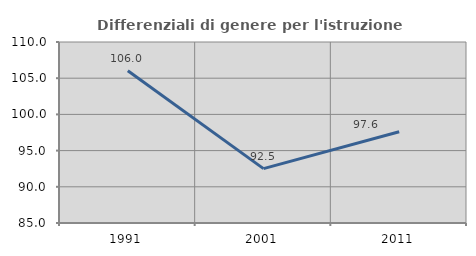
| Category | Differenziali di genere per l'istruzione superiore |
|---|---|
| 1991.0 | 106.026 |
| 2001.0 | 92.514 |
| 2011.0 | 97.604 |